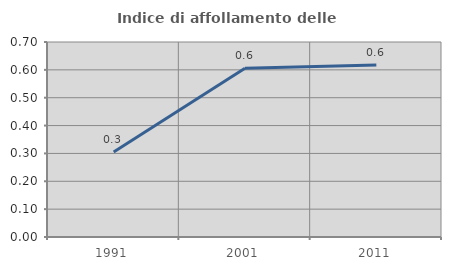
| Category | Indice di affollamento delle abitazioni  |
|---|---|
| 1991.0 | 0.305 |
| 2001.0 | 0.606 |
| 2011.0 | 0.617 |